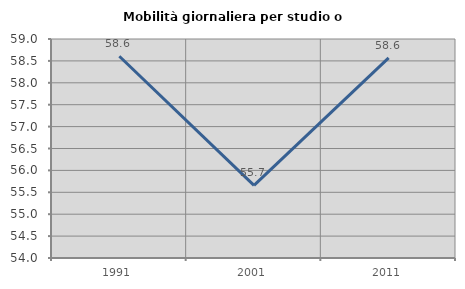
| Category | Mobilità giornaliera per studio o lavoro |
|---|---|
| 1991.0 | 58.606 |
| 2001.0 | 55.659 |
| 2011.0 | 58.569 |